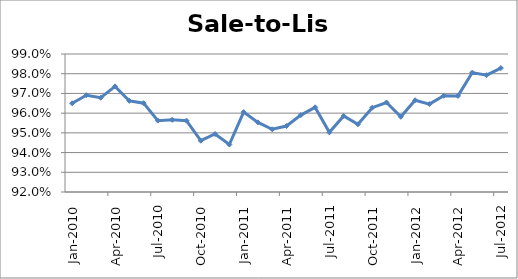
| Category | Series 0 |
|---|---|
| 2010-01-01 | 0.965 |
| 2010-02-01 | 0.969 |
| 2010-03-01 | 0.968 |
| 2010-04-01 | 0.974 |
| 2010-05-01 | 0.966 |
| 2010-06-01 | 0.965 |
| 2010-07-01 | 0.956 |
| 2010-08-01 | 0.957 |
| 2010-09-01 | 0.956 |
| 2010-10-01 | 0.946 |
| 2010-11-01 | 0.949 |
| 2010-12-01 | 0.944 |
| 2011-01-01 | 0.961 |
| 2011-02-01 | 0.955 |
| 2011-03-01 | 0.952 |
| 2011-04-01 | 0.953 |
| 2011-05-01 | 0.959 |
| 2011-06-01 | 0.963 |
| 2011-07-01 | 0.95 |
| 2011-08-01 | 0.959 |
| 2011-09-01 | 0.954 |
| 2011-10-01 | 0.963 |
| 2011-11-01 | 0.965 |
| 2011-12-01 | 0.958 |
| 2012-01-01 | 0.967 |
| 2012-02-01 | 0.965 |
| 2012-03-01 | 0.969 |
| 2012-04-01 | 0.969 |
| 2012-05-01 | 0.981 |
| 2012-06-01 | 0.979 |
| 2012-07-01 | 0.983 |